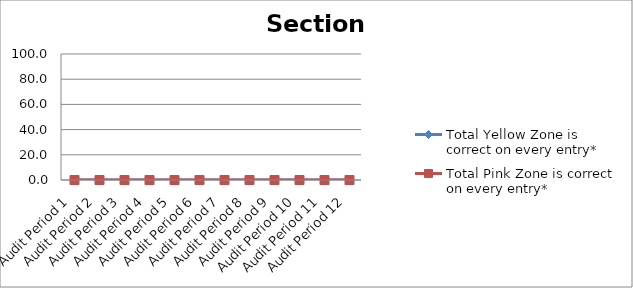
| Category | Total Yellow Zone is correct on every entry* | Total Pink Zone is correct on every entry* |
|---|---|---|
| Audit Period 1 | 0 | 0 |
| Audit Period 2 | 0 | 0 |
| Audit Period 3 | 0 | 0 |
| Audit Period 4 | 0 | 0 |
| Audit Period 5 | 0 | 0 |
| Audit Period 6 | 0 | 0 |
| Audit Period 7 | 0 | 0 |
| Audit Period 8 | 0 | 0 |
| Audit Period 9 | 0 | 0 |
| Audit Period 10 | 0 | 0 |
| Audit Period 11 | 0 | 0 |
| Audit Period 12 | 0 | 0 |